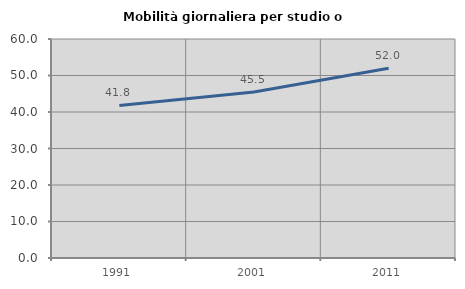
| Category | Mobilità giornaliera per studio o lavoro |
|---|---|
| 1991.0 | 41.789 |
| 2001.0 | 45.466 |
| 2011.0 | 51.963 |